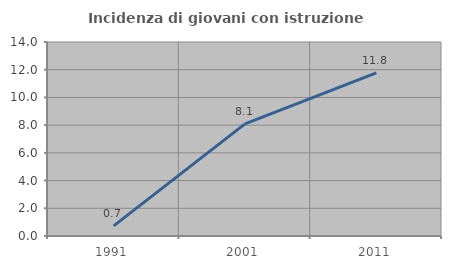
| Category | Incidenza di giovani con istruzione universitaria |
|---|---|
| 1991.0 | 0.735 |
| 2001.0 | 8.088 |
| 2011.0 | 11.765 |